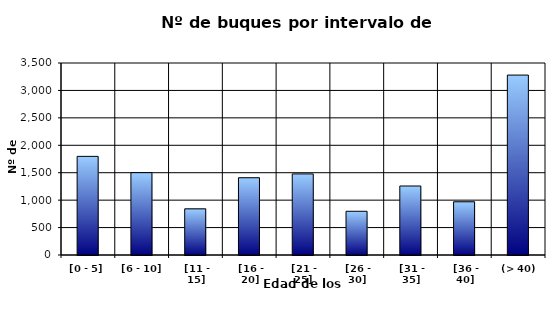
| Category | [0 - 5] |
|---|---|
| [0 - 5] | 1798 |
|  [6 - 10] | 1501 |
|  [11 - 15] | 841 |
|  [16 - 20] | 1408 |
|  [21 - 25] | 1478 |
|  [26 - 30] | 797 |
|  [31 - 35] | 1258 |
|  [36 - 40] | 970 |
|  (> 40) | 3280 |